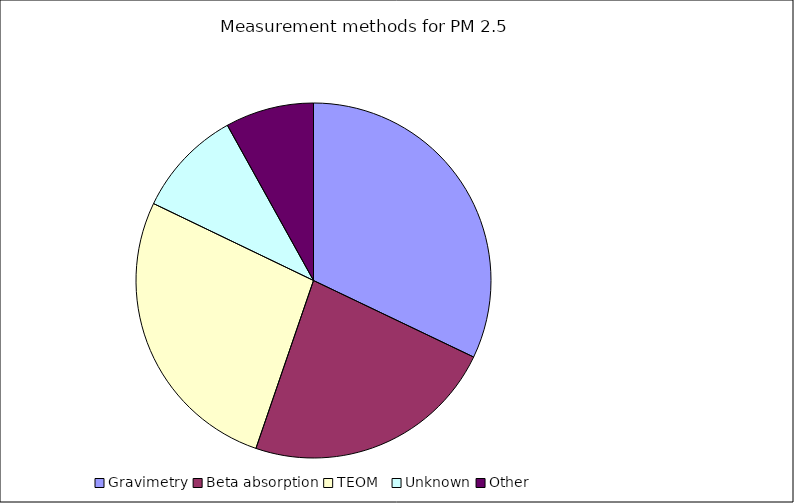
| Category | Series 0 |
|---|---|
| Gravimetry | 32.095 |
| Beta absorption | 23.162 |
| TEOM   | 26.877 |
| Unknown | 9.802 |
| Other | 8.063 |